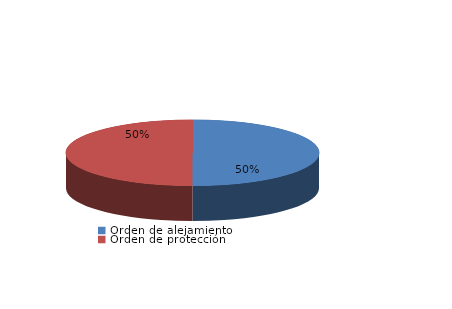
| Category | Series 0 |
|---|---|
| Orden de alejamiento | 7 |
| Orden de protección | 7 |